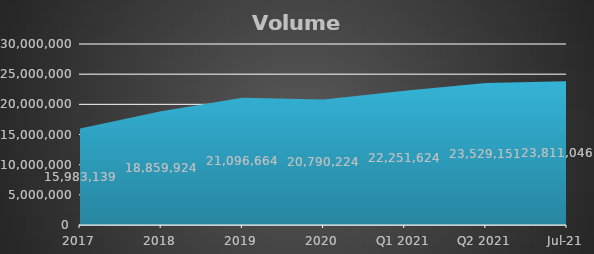
| Category | Metric Tons |
|---|---|
| 2017 | 15983139 |
| 2018 | 18859924 |
| 2019 | 21096664 |
| 2020 | 20790224 |
| Q1 2021 | 22251624 |
| Q2 2021 | 23529151 |
| Jul-21 | 23811046 |